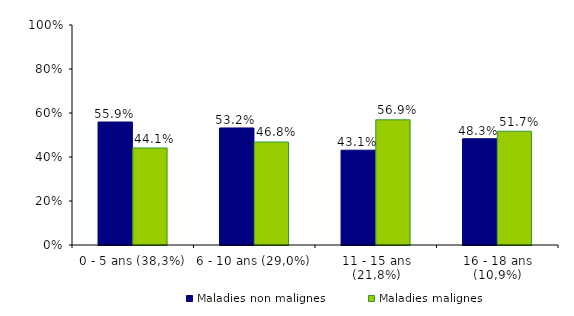
| Category | Maladies non malignes | Maladies malignes |
|---|---|---|
| 0 - 5 ans (38,3%) | 0.559 | 0.441 |
| 6 - 10 ans (29,0%) | 0.532 | 0.468 |
| 11 - 15 ans (21,8%) | 0.431 | 0.569 |
| 16 - 18 ans (10,9%) | 0.483 | 0.517 |